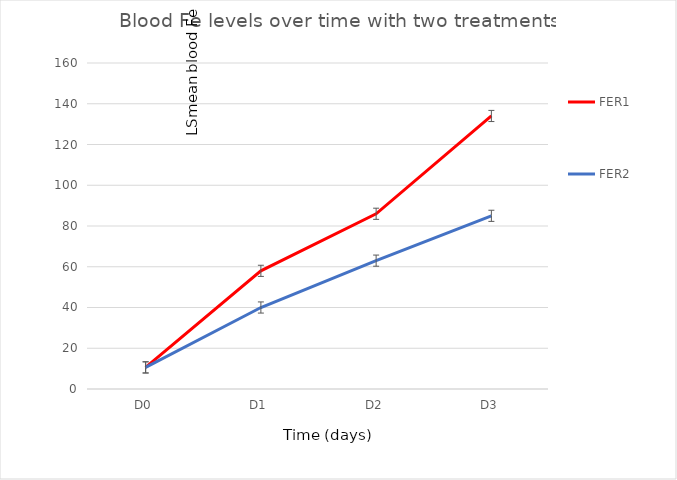
| Category | FER1 | FER2 |
|---|---|---|
| D0 | 10.6 | 10.6 |
| D1 | 58 | 40 |
| D2 | 86 | 63 |
| D3 | 134 | 85 |